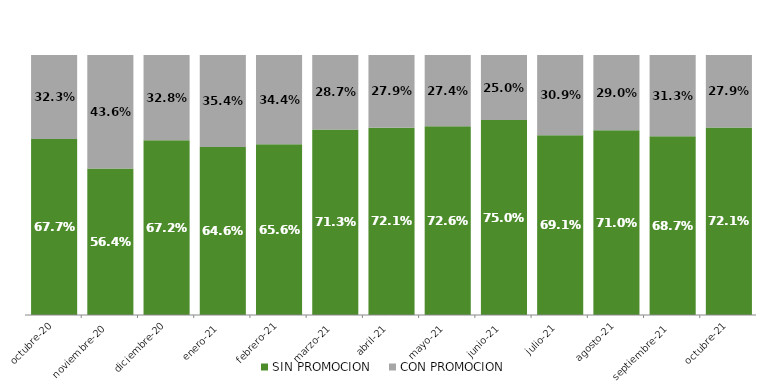
| Category | SIN PROMOCION   | CON PROMOCION   |
|---|---|---|
| 2020-10-01 | 0.677 | 0.323 |
| 2020-11-01 | 0.564 | 0.436 |
| 2020-12-01 | 0.672 | 0.328 |
| 2021-01-01 | 0.646 | 0.354 |
| 2021-02-01 | 0.656 | 0.344 |
| 2021-03-01 | 0.713 | 0.287 |
| 2021-04-01 | 0.721 | 0.279 |
| 2021-05-01 | 0.726 | 0.274 |
| 2021-06-01 | 0.75 | 0.25 |
| 2021-07-01 | 0.691 | 0.309 |
| 2021-08-01 | 0.71 | 0.29 |
| 2021-09-01 | 0.687 | 0.313 |
| 2021-10-01 | 0.721 | 0.279 |